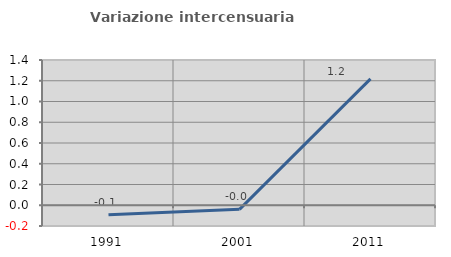
| Category | Variazione intercensuaria annua |
|---|---|
| 1991.0 | -0.092 |
| 2001.0 | -0.039 |
| 2011.0 | 1.218 |